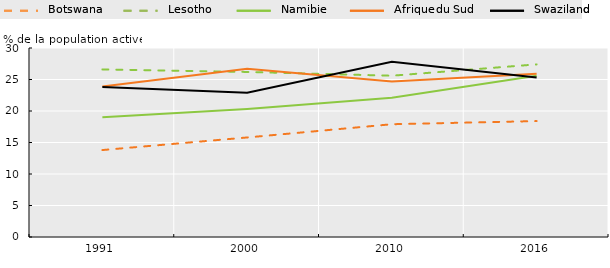
| Category | Botswana | Lesotho | Namibie | Afrique du Sud | Swaziland |
|---|---|---|---|---|---|
| 1991.0 | 13.8 | 26.6 | 19 | 23.9 | 23.8 |
| 2000.0 | 15.8 | 26.2 | 20.3 | 26.7 | 22.9 |
| 2010.0 | 17.9 | 25.6 | 22.1 | 24.7 | 27.8 |
| 2016.0 | 18.4 | 27.4 | 25.6 | 25.9 | 25.3 |